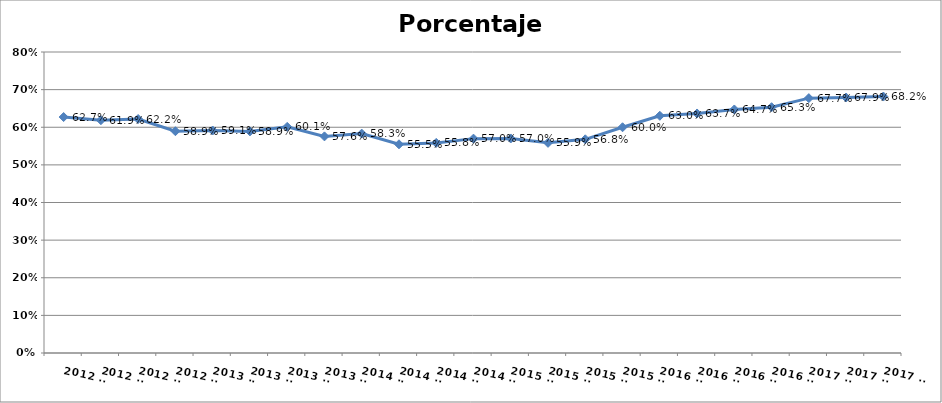
| Category | Porcentaje adoptadas |
|---|---|
| 2012 T1 | 0.627 |
| 2012 T2 | 0.619 |
| 2012 T3 | 0.622 |
| 2012 T4 | 0.589 |
| 2013 T1 | 0.591 |
| 2013 T2 | 0.589 |
| 2013 T3 | 0.601 |
| 2013 T4 | 0.576 |
| 2014 T1 | 0.583 |
| 2014 T2 | 0.555 |
| 2014 T3 | 0.558 |
| 2014 T4 | 0.57 |
| 2015 T1 | 0.57 |
| 2015 T2 | 0.559 |
| 2015 T3 | 0.568 |
| 2015 T4 | 0.6 |
| 2016 T1 | 0.63 |
| 2016 T2 | 0.637 |
| 2016 T3 | 0.647 |
| 2016 T4 | 0.653 |
| 2017 T1 | 0.677 |
| 2017 T2 | 0.679 |
| 2017 T3 | 0.682 |